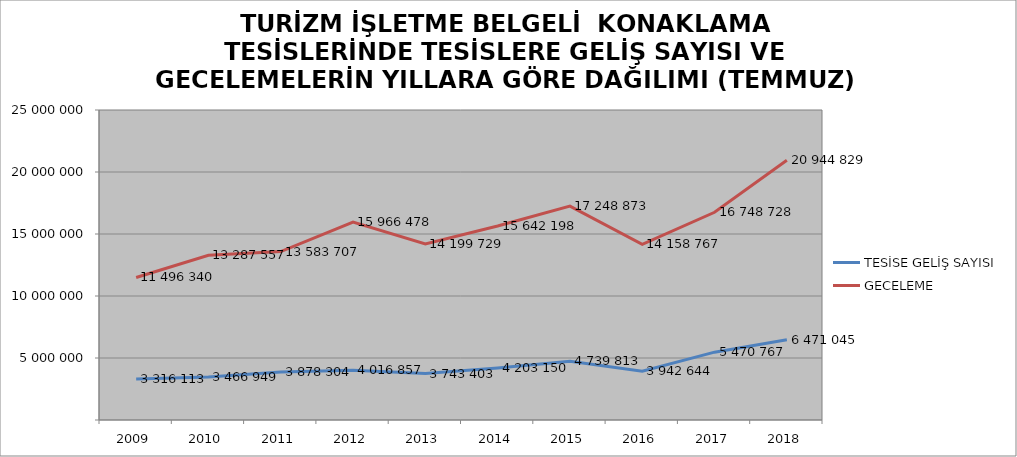
| Category | TESİSE GELİŞ SAYISI | GECELEME |
|---|---|---|
| 2009 | 3316113 | 11496340 |
| 2010 | 3466949 | 13287557 |
| 2011 | 3878304 | 13583707 |
| 2012 | 4016857 | 15966478 |
| 2013 | 3743403 | 14199729 |
| 2014 | 4203150 | 15642198 |
| 2015 | 4739813 | 17248873 |
| 2016 | 3942644 | 14158767 |
| 2017 | 5470767 | 16748728 |
| 2018 | 6471045 | 20944829 |